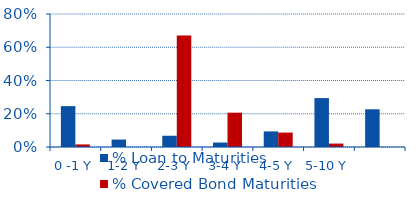
| Category | % Loan to Maturities | % Covered Bond Maturities |
|---|---|---|
| 0 -1 Y | 0.246 | 0.016 |
| 1-2 Y | 0.045 | 0 |
| 2-3 Y | 0.068 | 0.671 |
| 3-4 Y | 0.027 | 0.206 |
| 4-5 Y | 0.094 | 0.087 |
| 5-10 Y | 0.294 | 0.021 |